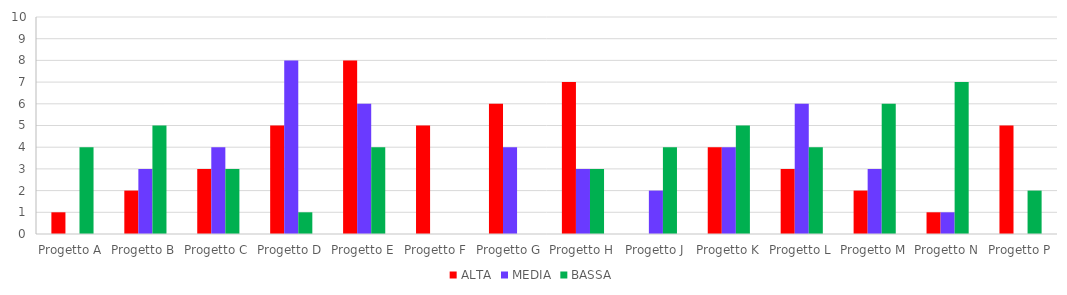
| Category | ALTA | MEDIA | BASSA |
|---|---|---|---|
| Progetto A | 1 | 0 | 4 |
| Progetto B | 2 | 3 | 5 |
| Progetto C | 3 | 4 | 3 |
| Progetto D | 5 | 8 | 1 |
| Progetto E | 8 | 6 | 4 |
| Progetto F | 5 | 0 | 0 |
| Progetto G | 6 | 4 | 0 |
| Progetto H | 7 | 3 | 3 |
| Progetto J | 0 | 2 | 4 |
| Progetto K | 4 | 4 | 5 |
| Progetto L | 3 | 6 | 4 |
| Progetto M | 2 | 3 | 6 |
| Progetto N | 1 | 1 | 7 |
| Progetto P | 5 | 0 | 2 |